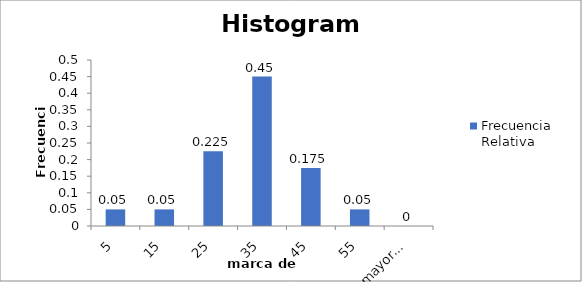
| Category | Frecuencia Relativa |
|---|---|
| 5 | 0.05 |
| 15 | 0.05 |
| 25 | 0.225 |
| 35 | 0.45 |
| 45 | 0.175 |
| 55 | 0.05 |
| y mayor... | 0 |